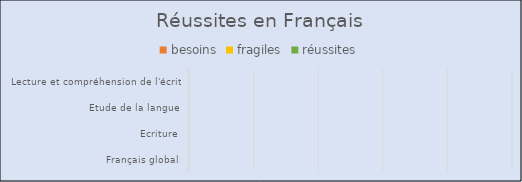
| Category | besoins | fragiles | réussites |
|---|---|---|---|
| Français global | 0 | 0 | 0 |
| Ecriture | 0 | 0 | 0 |
| Etude de la langue | 0 | 0 | 0 |
| Lecture et compréhension de l'écrit | 0 | 0 | 0 |